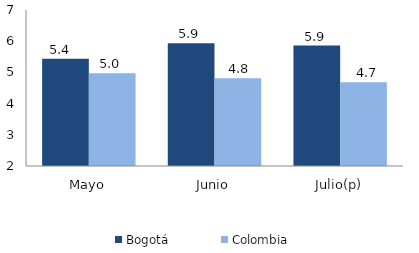
| Category | Bogotá | Colombia |
|---|---|---|
| Mayo | 5.434 | 4.971 |
| Junio | 5.932 | 4.816 |
| Julio(p) | 5.861 | 4.685 |